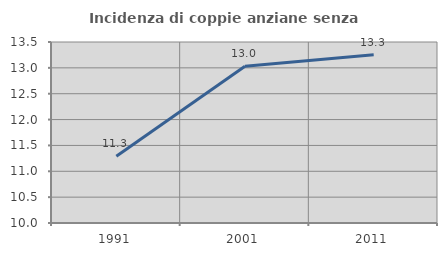
| Category | Incidenza di coppie anziane senza figli  |
|---|---|
| 1991.0 | 11.29 |
| 2001.0 | 13.031 |
| 2011.0 | 13.251 |